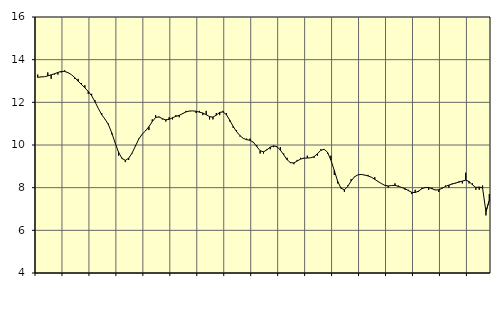
| Category | Piggar | Tillverkning av verkstadsvaror, SNI 25-30, 33 |
|---|---|---|
| nan | 13.3 | 13.17 |
| 87.0 | 13.2 | 13.19 |
| 87.0 | 13.2 | 13.2 |
| 87.0 | 13.4 | 13.24 |
| nan | 13.1 | 13.29 |
| 88.0 | 13.3 | 13.34 |
| 88.0 | 13.3 | 13.4 |
| 88.0 | 13.4 | 13.45 |
| nan | 13.5 | 13.45 |
| 89.0 | 13.4 | 13.39 |
| 89.0 | 13.3 | 13.3 |
| 89.0 | 13.1 | 13.16 |
| nan | 13.1 | 12.99 |
| 90.0 | 12.9 | 12.84 |
| 90.0 | 12.8 | 12.68 |
| 90.0 | 12.4 | 12.51 |
| nan | 12.4 | 12.31 |
| 91.0 | 12.1 | 12.03 |
| 91.0 | 11.7 | 11.71 |
| 91.0 | 11.5 | 11.42 |
| nan | 11.2 | 11.21 |
| 92.0 | 11 | 10.95 |
| 92.0 | 10.5 | 10.56 |
| 92.0 | 10.1 | 10.09 |
| nan | 9.5 | 9.66 |
| 93.0 | 9.4 | 9.37 |
| 93.0 | 9.2 | 9.28 |
| 93.0 | 9.3 | 9.38 |
| nan | 9.6 | 9.62 |
| 94.0 | 10 | 9.95 |
| 94.0 | 10.3 | 10.28 |
| 94.0 | 10.5 | 10.51 |
| nan | 10.7 | 10.66 |
| 95.0 | 10.7 | 10.86 |
| 95.0 | 11.2 | 11.1 |
| 95.0 | 11.4 | 11.29 |
| nan | 11.3 | 11.32 |
| 96.0 | 11.2 | 11.23 |
| 96.0 | 11.1 | 11.18 |
| 96.0 | 11.3 | 11.2 |
| nan | 11.2 | 11.28 |
| 97.0 | 11.4 | 11.34 |
| 97.0 | 11.3 | 11.39 |
| 97.0 | 11.5 | 11.47 |
| nan | 11.6 | 11.55 |
| 98.0 | 11.6 | 11.59 |
| 98.0 | 11.6 | 11.6 |
| 98.0 | 11.5 | 11.58 |
| nan | 11.6 | 11.54 |
| 99.0 | 11.4 | 11.5 |
| 99.0 | 11.6 | 11.42 |
| 99.0 | 11.2 | 11.33 |
| nan | 11.2 | 11.31 |
| 0.0 | 11.5 | 11.4 |
| 0.0 | 11.4 | 11.53 |
| 0.0 | 11.6 | 11.55 |
| nan | 11.5 | 11.42 |
| 1.0 | 11.1 | 11.16 |
| 1.0 | 10.8 | 10.87 |
| 1.0 | 10.7 | 10.63 |
| nan | 10.4 | 10.44 |
| 2.0 | 10.3 | 10.31 |
| 2.0 | 10.3 | 10.25 |
| 2.0 | 10.3 | 10.22 |
| nan | 10.1 | 10.13 |
| 3.0 | 10 | 9.93 |
| 3.0 | 9.6 | 9.73 |
| 3.0 | 9.6 | 9.68 |
| nan | 9.8 | 9.77 |
| 4.0 | 9.8 | 9.9 |
| 4.0 | 9.9 | 9.96 |
| 4.0 | 9.9 | 9.92 |
| nan | 9.9 | 9.76 |
| 5.0 | 9.6 | 9.54 |
| 5.0 | 9.4 | 9.31 |
| 5.0 | 9.2 | 9.17 |
| nan | 9.1 | 9.16 |
| 6.0 | 9.3 | 9.25 |
| 6.0 | 9.4 | 9.34 |
| 6.0 | 9.4 | 9.38 |
| nan | 9.5 | 9.39 |
| 7.0 | 9.4 | 9.4 |
| 7.0 | 9.4 | 9.45 |
| 7.0 | 9.5 | 9.59 |
| nan | 9.8 | 9.75 |
| 8.0 | 9.8 | 9.8 |
| 8.0 | 9.6 | 9.66 |
| 8.0 | 9.5 | 9.29 |
| nan | 8.6 | 8.81 |
| 9.0 | 8.2 | 8.3 |
| 9.0 | 8 | 7.97 |
| 9.0 | 7.8 | 7.9 |
| nan | 8.1 | 8.06 |
| 10.0 | 8.4 | 8.31 |
| 10.0 | 8.5 | 8.51 |
| 10.0 | 8.6 | 8.6 |
| nan | 8.6 | 8.62 |
| 11.0 | 8.6 | 8.59 |
| 11.0 | 8.6 | 8.55 |
| 11.0 | 8.5 | 8.49 |
| nan | 8.5 | 8.39 |
| 12.0 | 8.3 | 8.29 |
| 12.0 | 8.2 | 8.19 |
| 12.0 | 8.1 | 8.11 |
| nan | 8 | 8.08 |
| 13.0 | 8.1 | 8.1 |
| 13.0 | 8.2 | 8.11 |
| 13.0 | 8.1 | 8.06 |
| nan | 8 | 8.01 |
| 14.0 | 7.9 | 7.95 |
| 14.0 | 7.9 | 7.86 |
| 14.0 | 7.7 | 7.78 |
| nan | 7.9 | 7.77 |
| 15.0 | 7.8 | 7.84 |
| 15.0 | 8 | 7.95 |
| 15.0 | 8 | 8.01 |
| nan | 7.9 | 8.01 |
| 16.0 | 8 | 7.95 |
| 16.0 | 7.9 | 7.89 |
| 16.0 | 7.8 | 7.9 |
| nan | 8 | 7.97 |
| 17.0 | 8.1 | 8.06 |
| 17.0 | 8 | 8.12 |
| 17.0 | 8.2 | 8.17 |
| nan | 8.2 | 8.22 |
| 18.0 | 8.3 | 8.26 |
| 18.0 | 8.2 | 8.31 |
| 18.0 | 8.7 | 8.35 |
| nan | 8.2 | 8.29 |
| 19.0 | 8.2 | 8.13 |
| 19.0 | 7.9 | 8.01 |
| 19.0 | 7.9 | 8.03 |
| nan | 8.1 | 7.99 |
| 20.0 | 6.7 | 6.87 |
| 20.0 | 7.7 | 7.41 |